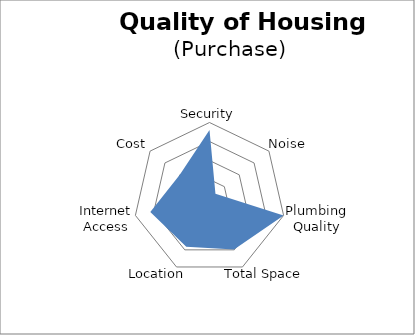
| Category | Series 0 |
|---|---|
| Security | 90 |
| Noise | 10 |
| Plumbing Quality | 100 |
| Total Space | 74.383 |
| Location | 70.469 |
| Internet Access | 79.891 |
| Cost | 50 |